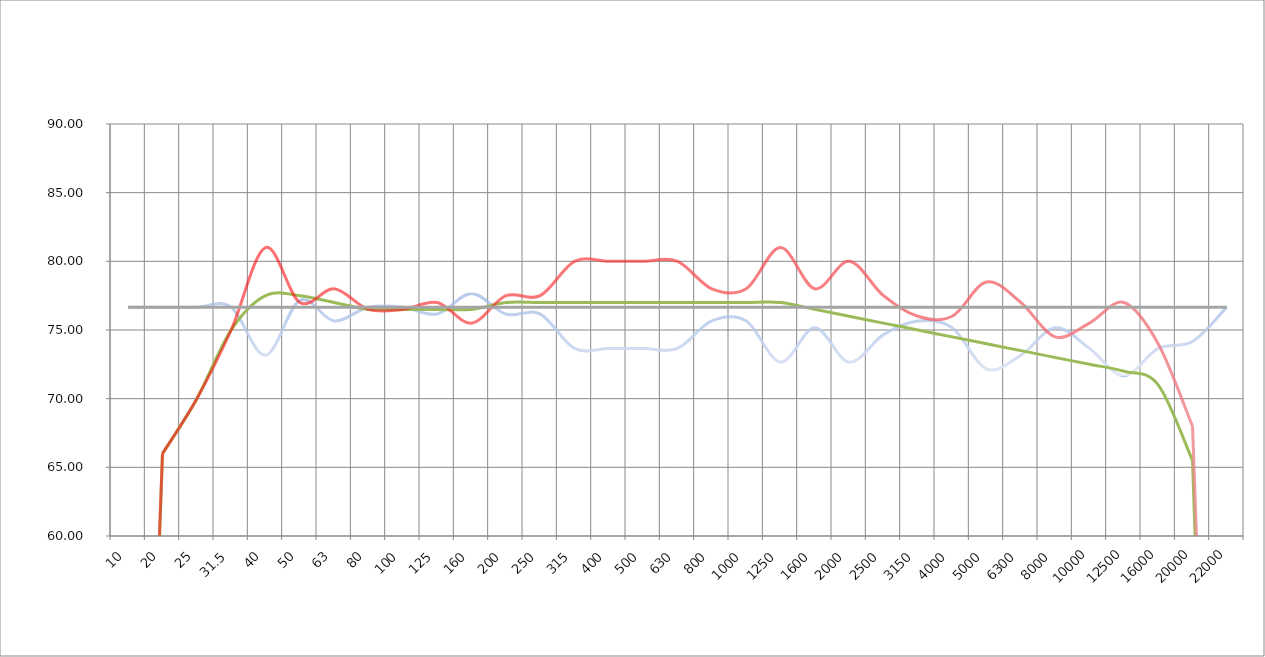
| Category | Filter | Predicted | Mesured | Flat | Prdicted Flat |
|---|---|---|---|---|---|
| 10.0 | 76.661 | -6 | 0 | 76.661 |  |
| 20.0 | 76.661 | 66 | 66 | 76.661 |  |
| 25.0 | 76.661 | 70 | 70 | 76.661 |  |
| 31.5 | 76.661 | 75 | 75 | 76.661 |  |
| 40.0 | 73.161 | 77.5 | 81 | 76.661 |  |
| 50.0 | 77.161 | 77.5 | 77 | 76.661 |  |
| 63.0 | 75.661 | 77 | 78 | 76.661 |  |
| 80.0 | 76.661 | 76.5 | 76.5 | 76.661 |  |
| 100.0 | 76.661 | 76.5 | 76.5 | 76.661 |  |
| 125.0 | 76.161 | 76.5 | 77 | 76.661 |  |
| 160.0 | 77.661 | 76.5 | 75.5 | 76.661 |  |
| 200.0 | 76.161 | 77 | 77.5 | 76.661 |  |
| 250.0 | 76.161 | 77 | 77.5 | 76.661 |  |
| 315.0 | 73.661 | 77 | 80 | 76.661 |  |
| 400.0 | 73.661 | 77 | 80 | 76.661 |  |
| 500.0 | 73.661 | 77 | 80 | 76.661 |  |
| 630.0 | 73.661 | 77 | 80 | 76.661 |  |
| 800.0 | 75.661 | 77 | 78 | 76.661 |  |
| 1000.0 | 75.661 | 77 | 78 | 76.661 |  |
| 1250.0 | 72.661 | 77 | 81 | 76.661 |  |
| 1600.0 | 75.161 | 76.5 | 78 | 76.661 |  |
| 2000.0 | 72.661 | 76 | 80 | 76.661 |  |
| 2500.0 | 74.661 | 75.5 | 77.5 | 76.661 |  |
| 3150.0 | 75.661 | 75 | 76 | 76.661 |  |
| 4000.0 | 75.161 | 74.5 | 76 | 76.661 |  |
| 5000.0 | 72.161 | 74 | 78.5 | 76.661 |  |
| 6300.0 | 73.161 | 73.5 | 77 | 76.661 |  |
| 8000.0 | 75.161 | 73 | 74.5 | 76.661 |  |
| 10000.0 | 73.661 | 72.5 | 75.5 | 76.661 |  |
| 12500.0 | 71.661 | 72 | 77 | 76.661 |  |
| 16000.0 | 73.661 | 71 | 74 | 76.661 |  |
| 20000.0 | 74.161 | 65.5 | 68 | 76.661 |  |
| 22000.0 | 76.661 | -6 | 0 | 76.661 |  |